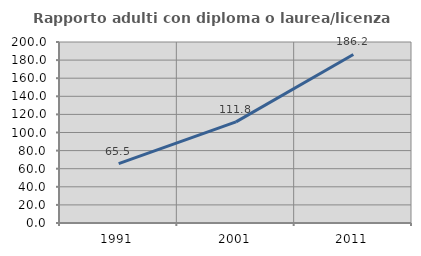
| Category | Rapporto adulti con diploma o laurea/licenza media  |
|---|---|
| 1991.0 | 65.529 |
| 2001.0 | 111.789 |
| 2011.0 | 186.195 |